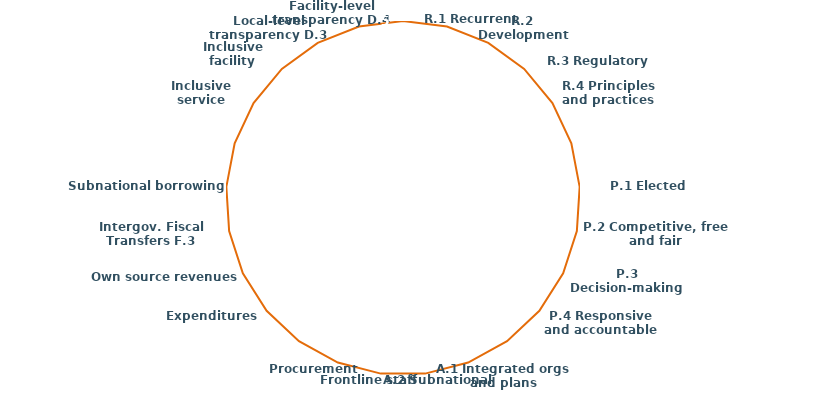
| Category | Series 0 |
|---|---|
|  | 5 |
| R.1 Recurrent functions | 5 |
| R.2 Development functions | 5 |
| R.3 Regulatory functions | 5 |
| R.4 Principles and practices | 5 |
|  | 5 |
| P.1 Elected leadership | 5 |
| P.2 Competitive, free and fair | 5 |
| P.3 Decision-making power | 5 |
| P.4 Responsive and accountable | 5 |
|  | 5 |
| A.1 Integrated orgs and plans | 5 |
| A.2 Subnational officers | 5 |
| Frontline staff  A.3 | 5 |
| Procurement A.4 | 5 |
|  | 5 |
| Expenditures F.1  | 5 |
| Own source revenues F.2 | 5 |
| Intergov. Fiscal Transfers F.3 | 5 |
| Subnational borrowing F.4 | 5 |
|  | 5 |
| Inclusive service governance D.1  | 5 |
| Inclusive facility governance D.2 | 5 |
| Local-level transparency D.3  | 5 |
| Facility-level transparency D.4  | 5 |